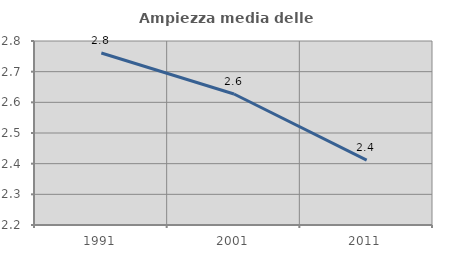
| Category | Ampiezza media delle famiglie |
|---|---|
| 1991.0 | 2.761 |
| 2001.0 | 2.627 |
| 2011.0 | 2.411 |